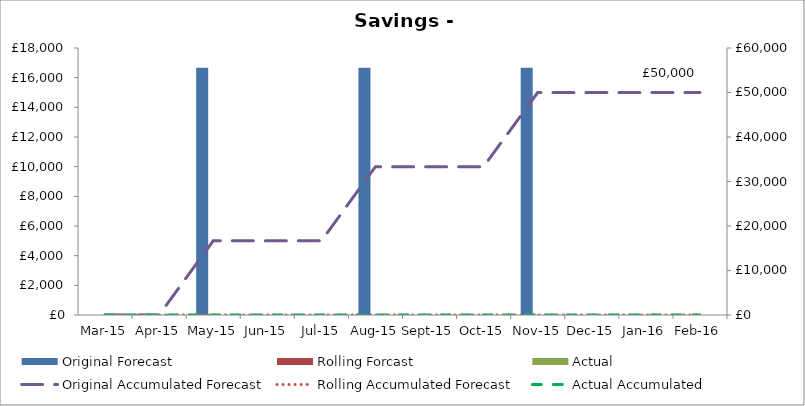
| Category | Original Forecast | Rolling Forcast | Actual |
|---|---|---|---|
| 2015-03-01 | 0 | 0 | 0 |
| 2015-04-01 | 0 | 0 | 0 |
| 2015-05-01 | 16666.67 | 0 | 0 |
| 2015-06-01 | 0 | 0 | 0 |
| 2015-07-01 | 0 | 0 | 0 |
| 2015-08-01 | 16666.67 | 0 | 0 |
| 2015-09-01 | 0 | 0 | 0 |
| 2015-10-01 | 0 | 0 | 0 |
| 2015-11-01 | 16666.67 | 0 | 0 |
| 2015-12-01 | 0 | 0 | 0 |
| 2016-01-01 | 0 | 0 | 0 |
| 2016-02-01 | 0 | 0 | 0 |